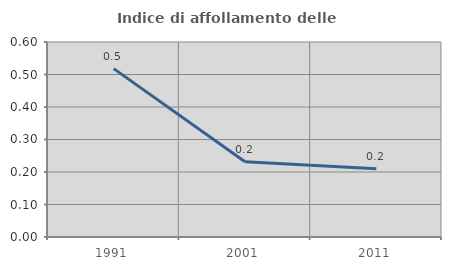
| Category | Indice di affollamento delle abitazioni  |
|---|---|
| 1991.0 | 0.518 |
| 2001.0 | 0.231 |
| 2011.0 | 0.21 |